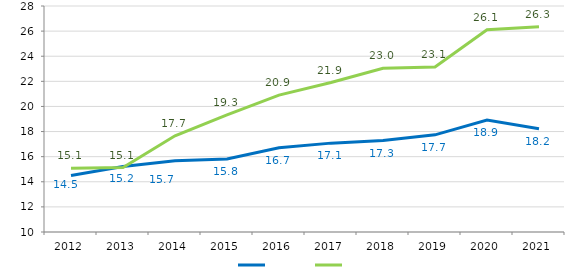
| Category | Series 0 | Series 1 |
|---|---|---|
| 2012 | 14.504 | 15.084 |
| 2013 | 15.22 | 15.134 |
| 2014 | 15.672 | 17.667 |
| 2015 | 15.823 | 19.323 |
| 2016 | 16.712 | 20.899 |
| 2017 | 17.078 | 21.905 |
| 2018 | 17.28 | 23.043 |
| 2019 | 17.737 | 23.135 |
| 2020 | 18.914 | 26.11 |
| 2021 | 18.227 | 26.343 |